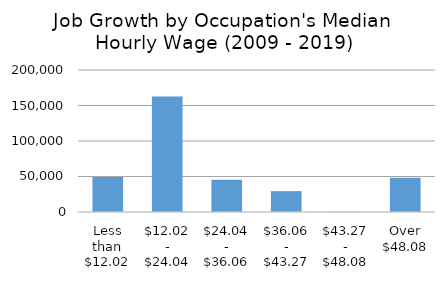
| Category | Series 0 |
|---|---|
| Less than $12.02 | 49272.477 |
| $12.02 - $24.04 | 162666.03 |
| $24.04 - $36.06 | 45319.726 |
| $36.06 - $43.27 | 29417.215 |
| $43.27 - $48.08 | 329.512 |
| Over $48.08 | 48224.658 |